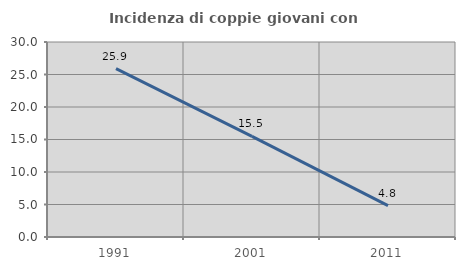
| Category | Incidenza di coppie giovani con figli |
|---|---|
| 1991.0 | 25.895 |
| 2001.0 | 15.493 |
| 2011.0 | 4.819 |